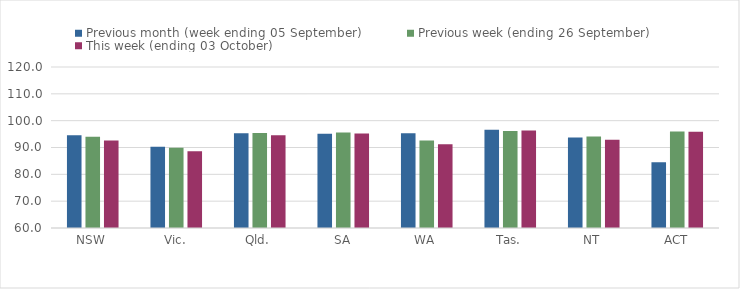
| Category | Previous month (week ending 05 September) | Previous week (ending 26 September) | This week (ending 03 October) |
|---|---|---|---|
| NSW | 94.6 | 93.99 | 92.65 |
| Vic. | 90.25 | 89.92 | 88.6 |
| Qld. | 95.3 | 95.42 | 94.55 |
| SA | 95.16 | 95.63 | 95.19 |
| WA | 95.3 | 92.62 | 91.19 |
| Tas. | 96.58 | 96.18 | 96.36 |
| NT | 93.7 | 94.13 | 92.91 |
| ACT | 84.54 | 95.92 | 95.86 |